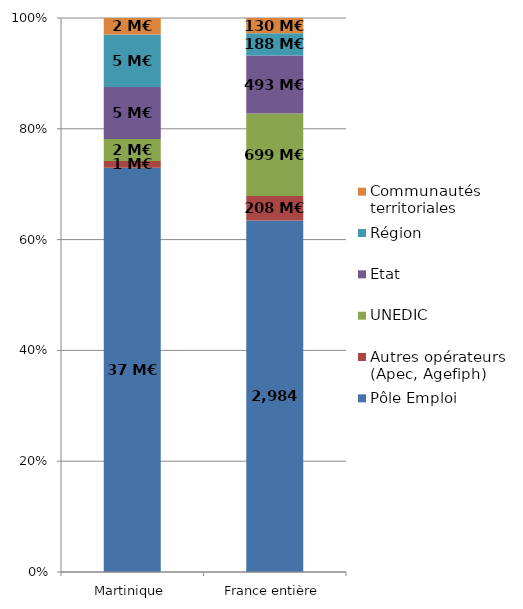
| Category | Pôle Emploi | Autres opérateurs (Apec, Agefiph) | UNEDIC | Etat | Région | Communautés territoriales |
|---|---|---|---|---|---|---|
| Martinique | 37.048 | 0.606 | 2.026 | 4.773 | 4.811 | 1.502 |
| France entière | 2983.694 | 207.577 | 699.479 | 493.308 | 188.079 | 129.71 |